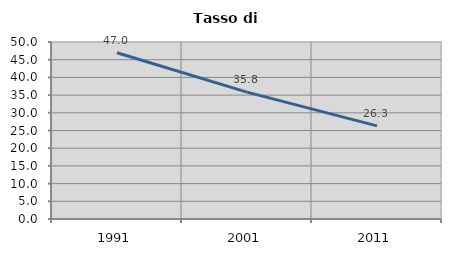
| Category | Tasso di disoccupazione   |
|---|---|
| 1991.0 | 46.976 |
| 2001.0 | 35.838 |
| 2011.0 | 26.31 |